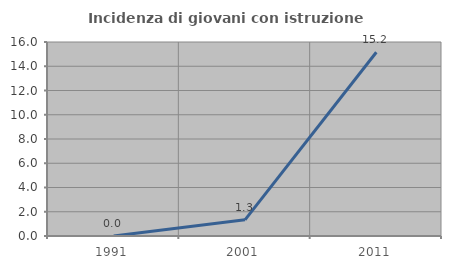
| Category | Incidenza di giovani con istruzione universitaria |
|---|---|
| 1991.0 | 0 |
| 2001.0 | 1.333 |
| 2011.0 | 15.152 |